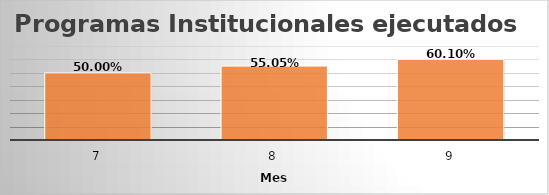
| Category | Series 0 |
|---|---|
| 7.0 | 0.5 |
| 8.0 | 0.55 |
| 9.0 | 0.601 |